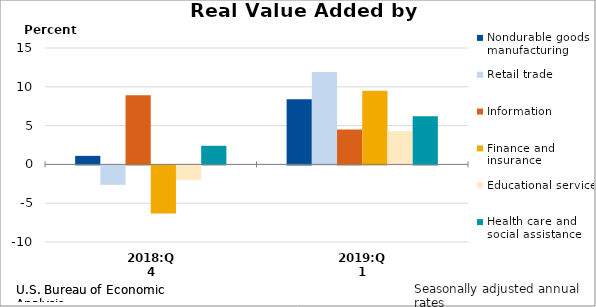
| Category | Nondurable goods manufacturing  | Retail trade | Information | Finance and insurance | Educational services | Health care and social assistance |
|---|---|---|---|---|---|---|
| 2018:Q4 | 1.1 | -2.5 | 8.9 | -6.2 | -1.9 | 2.4 |
| 2019:Q1 | 8.4 | 11.9 | 4.5 | 9.5 | 4.3 | 6.2 |